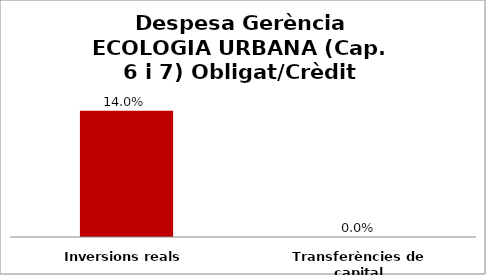
| Category | Series 0 |
|---|---|
| Inversions reals | 0.14 |
| Transferències de capital | 0 |